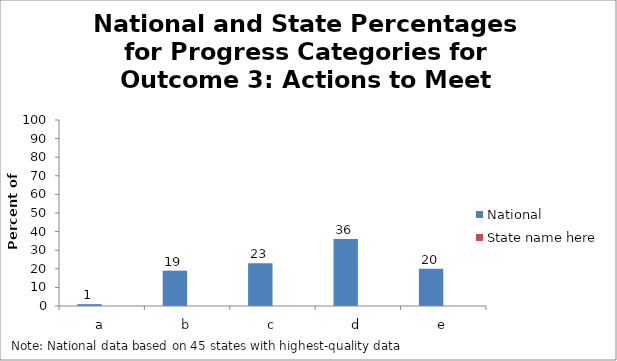
| Category | National | State name here |
|---|---|---|
| a | 1 |  |
| b | 19 |  |
| c | 23 |  |
| d | 36 |  |
| e | 20 |  |